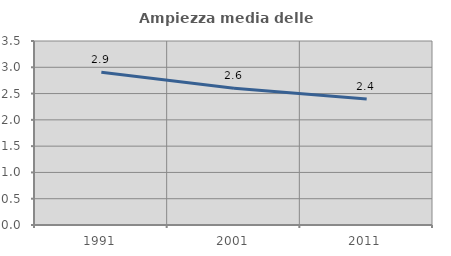
| Category | Ampiezza media delle famiglie |
|---|---|
| 1991.0 | 2.906 |
| 2001.0 | 2.6 |
| 2011.0 | 2.398 |